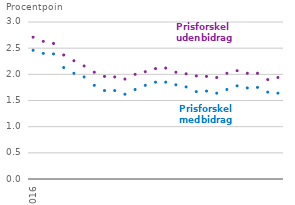
| Category | Prisforskel med bidrag | Prisforskel uden bidrag |
|---|---|---|
| 2016-01-01 | 2.46 | 2.71 |
| 2016-02-01 | 2.4 | 2.63 |
| 2016-03-01 | 2.39 | 2.59 |
| 2016-04-01 | 2.13 | 2.37 |
| 2016-05-01 | 2.02 | 2.26 |
| 2016-06-01 | 1.95 | 2.16 |
| 2016-07-01 | 1.79 | 2.04 |
| 2016-08-01 | 1.69 | 1.96 |
| 2016-09-01 | 1.69 | 1.95 |
| 2016-10-01 | 1.62 | 1.91 |
| 2016-11-01 | 1.71 | 2 |
| 2016-12-01 | 1.79 | 2.05 |
| 2017-01-01 | 1.85 | 2.11 |
| 2017-02-01 | 1.85 | 2.12 |
| 2017-03-01 | 1.8 | 2.04 |
| 2017-04-01 | 1.76 | 2.01 |
| 2017-05-01 | 1.67 | 1.97 |
| 2017-06-01 | 1.68 | 1.96 |
| 2017-07-01 | 1.64 | 1.94 |
| 2017-08-01 | 1.71 | 2.02 |
| 2017-09-01 | 1.78 | 2.07 |
| 2017-10-01 | 1.74 | 2.02 |
| 2017-11-01 | 1.75 | 2.02 |
| 2017-12-01 | 1.66 | 1.9 |
| 2018-01-01 | 1.64 | 1.94 |